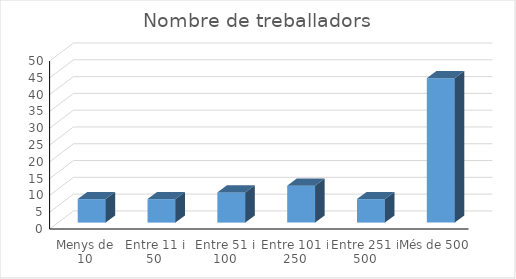
| Category | Series 0 |
|---|---|
| Menys de 10 | 7 |
| Entre 11 i 50 | 7 |
| Entre 51 i 100 | 9 |
| Entre 101 i 250 | 11 |
| Entre 251 i 500 | 7 |
| Més de 500 | 43 |